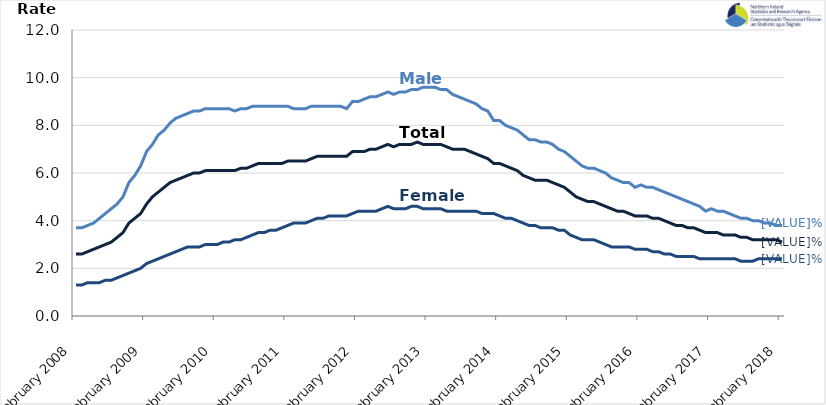
| Category | Male | Female | Total |
|---|---|---|---|
| 2008-02-01 | 3.7 | 1.3 | 2.6 |
| 2008-03-01 | 3.7 | 1.3 | 2.6 |
| 2008-04-01 | 3.8 | 1.4 | 2.7 |
| 2008-05-01 | 3.9 | 1.4 | 2.8 |
| 2008-06-01 | 4.1 | 1.4 | 2.9 |
| 2008-07-01 | 4.3 | 1.5 | 3 |
| 2008-08-01 | 4.5 | 1.5 | 3.1 |
| 2008-09-01 | 4.7 | 1.6 | 3.3 |
| 2008-10-01 | 5 | 1.7 | 3.5 |
| 2008-11-01 | 5.6 | 1.8 | 3.9 |
| 2008-12-01 | 5.9 | 1.9 | 4.1 |
| 2009-01-01 | 6.3 | 2 | 4.3 |
| 2009-02-01 | 6.9 | 2.2 | 4.7 |
| 2009-03-01 | 7.2 | 2.3 | 5 |
| 2009-04-01 | 7.6 | 2.4 | 5.2 |
| 2009-05-01 | 7.8 | 2.5 | 5.4 |
| 2009-06-01 | 8.1 | 2.6 | 5.6 |
| 2009-07-01 | 8.3 | 2.7 | 5.7 |
| 2009-08-01 | 8.4 | 2.8 | 5.8 |
| 2009-09-01 | 8.5 | 2.9 | 5.9 |
| 2009-10-01 | 8.6 | 2.9 | 6 |
| 2009-11-01 | 8.6 | 2.9 | 6 |
| 2009-12-01 | 8.7 | 3 | 6.1 |
| 2010-01-01 | 8.7 | 3 | 6.1 |
| 2010-02-01 | 8.7 | 3 | 6.1 |
| 2010-03-01 | 8.7 | 3.1 | 6.1 |
| 2010-04-01 | 8.7 | 3.1 | 6.1 |
| 2010-05-01 | 8.6 | 3.2 | 6.1 |
| 2010-06-01 | 8.7 | 3.2 | 6.2 |
| 2010-07-01 | 8.7 | 3.3 | 6.2 |
| 2010-08-01 | 8.8 | 3.4 | 6.3 |
| 2010-09-01 | 8.8 | 3.5 | 6.4 |
| 2010-10-01 | 8.8 | 3.5 | 6.4 |
| 2010-11-01 | 8.8 | 3.6 | 6.4 |
| 2010-12-01 | 8.8 | 3.6 | 6.4 |
| 2011-01-01 | 8.8 | 3.7 | 6.4 |
| 2011-02-01 | 8.8 | 3.8 | 6.5 |
| 2011-03-01 | 8.7 | 3.9 | 6.5 |
| 2011-04-01 | 8.7 | 3.9 | 6.5 |
| 2011-05-01 | 8.7 | 3.9 | 6.5 |
| 2011-06-01 | 8.8 | 4 | 6.6 |
| 2011-07-01 | 8.8 | 4.1 | 6.7 |
| 2011-08-01 | 8.8 | 4.1 | 6.7 |
| 2011-09-01 | 8.8 | 4.2 | 6.7 |
| 2011-10-01 | 8.8 | 4.2 | 6.7 |
| 2011-11-01 | 8.8 | 4.2 | 6.7 |
| 2011-12-01 | 8.7 | 4.2 | 6.7 |
| 2012-01-01 | 9 | 4.3 | 6.9 |
| 2012-02-01 | 9 | 4.4 | 6.9 |
| 2012-03-01 | 9.1 | 4.4 | 6.9 |
| 2012-04-01 | 9.2 | 4.4 | 7 |
| 2012-05-01 | 9.2 | 4.4 | 7 |
| 2012-06-01 | 9.3 | 4.5 | 7.1 |
| 2012-07-01 | 9.4 | 4.6 | 7.2 |
| 2012-08-01 | 9.3 | 4.5 | 7.1 |
| 2012-09-01 | 9.4 | 4.5 | 7.2 |
| 2012-10-01 | 9.4 | 4.5 | 7.2 |
| 2012-11-01 | 9.5 | 4.6 | 7.2 |
| 2012-12-01 | 9.5 | 4.6 | 7.3 |
| 2013-01-01 | 9.6 | 4.5 | 7.2 |
| 2013-02-01 | 9.6 | 4.5 | 7.2 |
| 2013-03-01 | 9.6 | 4.5 | 7.2 |
| 2013-04-01 | 9.5 | 4.5 | 7.2 |
| 2013-05-01 | 9.5 | 4.4 | 7.1 |
| 2013-06-01 | 9.3 | 4.4 | 7 |
| 2013-07-01 | 9.2 | 4.4 | 7 |
| 2013-08-01 | 9.1 | 4.4 | 7 |
| 2013-09-01 | 9 | 4.4 | 6.9 |
| 2013-10-01 | 8.9 | 4.4 | 6.8 |
| 2013-11-01 | 8.7 | 4.3 | 6.7 |
| 2013-12-01 | 8.6 | 4.3 | 6.6 |
| 2014-01-01 | 8.2 | 4.3 | 6.4 |
| 2014-02-01 | 8.2 | 4.2 | 6.4 |
| 2014-03-01 | 8 | 4.1 | 6.3 |
| 2014-04-01 | 7.9 | 4.1 | 6.2 |
| 2014-05-01 | 7.8 | 4 | 6.1 |
| 2014-06-01 | 7.6 | 3.9 | 5.9 |
| 2014-07-01 | 7.4 | 3.8 | 5.8 |
| 2014-08-01 | 7.4 | 3.8 | 5.7 |
| 2014-09-01 | 7.3 | 3.7 | 5.7 |
| 2014-10-01 | 7.3 | 3.7 | 5.7 |
| 2014-11-01 | 7.2 | 3.7 | 5.6 |
| 2014-12-01 | 7 | 3.6 | 5.5 |
| 2015-01-01 | 6.9 | 3.6 | 5.4 |
| 2015-02-01 | 6.7 | 3.4 | 5.2 |
| 2015-03-01 | 6.5 | 3.3 | 5 |
| 2015-04-01 | 6.3 | 3.2 | 4.9 |
| 2015-05-01 | 6.2 | 3.2 | 4.8 |
| 2015-06-01 | 6.2 | 3.2 | 4.8 |
| 2015-07-01 | 6.1 | 3.1 | 4.7 |
| 2015-08-01 | 6 | 3 | 4.6 |
| 2015-09-01 | 5.8 | 2.9 | 4.5 |
| 2015-10-01 | 5.7 | 2.9 | 4.4 |
| 2015-11-01 | 5.6 | 2.9 | 4.4 |
| 2015-12-01 | 5.6 | 2.9 | 4.3 |
| 2016-01-01 | 5.4 | 2.8 | 4.2 |
| 2016-02-01 | 5.5 | 2.8 | 4.2 |
| 2016-03-01 | 5.4 | 2.8 | 4.2 |
| 2016-04-01 | 5.4 | 2.7 | 4.1 |
| 2016-05-01 | 5.3 | 2.7 | 4.1 |
| 2016-06-01 | 5.2 | 2.6 | 4 |
| 2016-07-01 | 5.1 | 2.6 | 3.9 |
| 2016-08-01 | 5 | 2.5 | 3.8 |
| 2016-09-01 | 4.9 | 2.5 | 3.8 |
| 2016-10-01 | 4.8 | 2.5 | 3.7 |
| 2016-11-01 | 4.7 | 2.5 | 3.7 |
| 2016-12-01 | 4.6 | 2.4 | 3.6 |
| 2017-01-01 | 4.4 | 2.4 | 3.5 |
| 2017-02-01 | 4.5 | 2.4 | 3.5 |
| 2017-03-01 | 4.4 | 2.4 | 3.5 |
| 2017-04-01 | 4.4 | 2.4 | 3.4 |
| 2017-05-01 | 4.3 | 2.4 | 3.4 |
| 2017-06-01 | 4.2 | 2.4 | 3.4 |
| 2017-07-01 | 4.1 | 2.3 | 3.3 |
| 2017-08-01 | 4.1 | 2.3 | 3.3 |
| 2017-09-01 | 4 | 2.3 | 3.2 |
| 2017-10-01 | 4 | 2.4 | 3.2 |
| 2017-11-01 | 3.9 | 2.4 | 3.2 |
| 2017-12-01 | 3.9 | 2.4 | 3.2 |
| 2018-01-01 | 3.8 | 2.4 | 3.2 |
| 2018-02-01 | 3.8 | 2.4 | 3.1 |